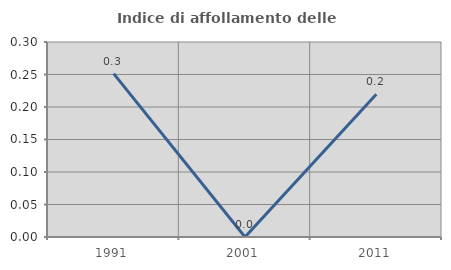
| Category | Indice di affollamento delle abitazioni  |
|---|---|
| 1991.0 | 0.251 |
| 2001.0 | 0 |
| 2011.0 | 0.22 |